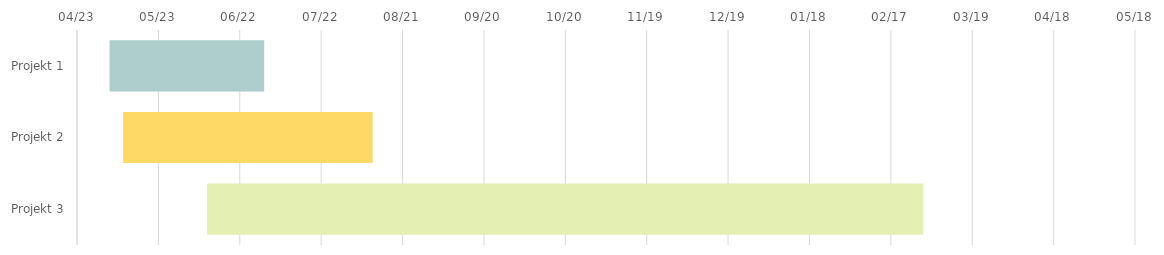
| Category | BEGINNEN | Dauer |
|---|---|---|
| Projekt 1 | 2025-05-05 | 57 |
| Projekt 2 | 2025-05-10 | 92 |
| Projekt 3 | 2025-06-10 | 264 |